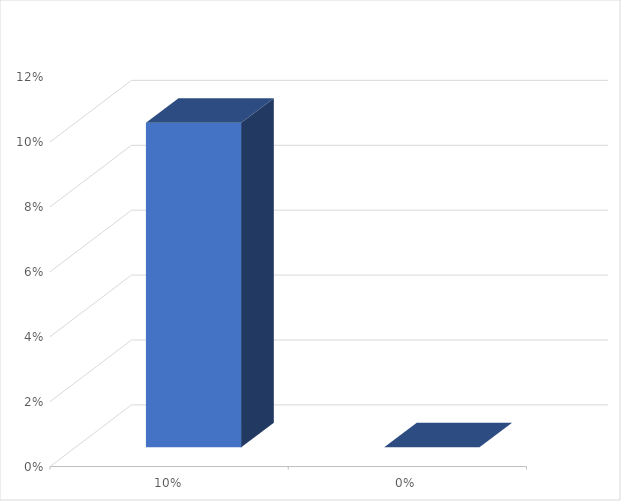
| Category | Series 0 |
|---|---|
| 10% | 0.1 |
| 0% | 0 |